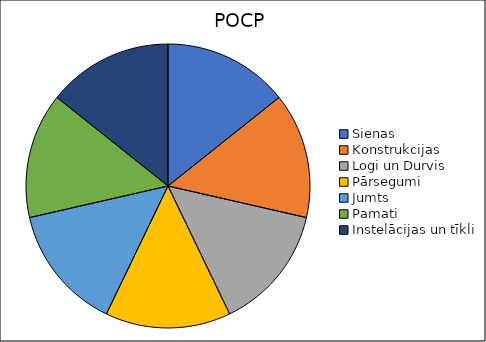
| Category | 0.004 |
|---|---|
| Sienas  | 0.004 |
| Konstrukcijas | 0.004 |
| Logi un Durvis | 0.004 |
| Pārsegumi | 0.004 |
| Jumts | 0.004 |
| Pamati | 0.004 |
| Instelācijas un tīkli | 0.004 |